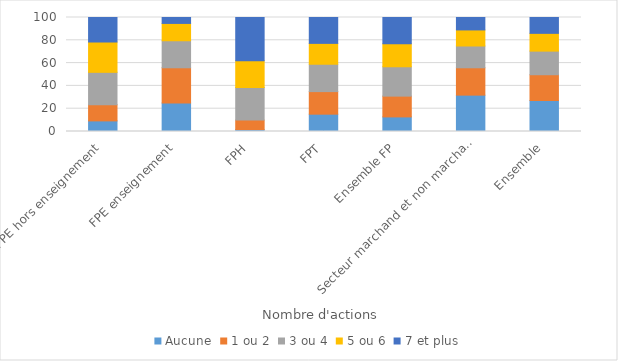
| Category | Aucune | 1 ou 2 | 3 ou 4 | 5 ou 6 | 7 et plus |
|---|---|---|---|---|---|
| FPE hors enseignement | 9.3 | 14.2 | 28.4 | 26.6 | 21.5 |
| FPE enseignement | 25 | 30.9 | 23.7 | 15.2 | 5.3 |
| FPH | 1.7 | 8.3 | 28.6 | 23.5 | 37.9 |
| FPT | 15.2 | 19.8 | 24 | 18.3 | 22.7 |
| Ensemble FP | 12.8 | 18.23 | 25.75 | 20.19 | 23.03 |
| Secteur marchand et non marchand | 31.9 | 24 | 19.1 | 14.1 | 11 |
| Ensemble | 27.2 | 22.6 | 20.7 | 15.6 | 13.9 |